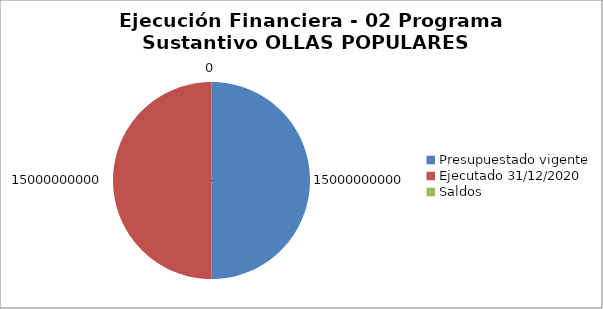
| Category | 0 0 0 |
|---|---|
| Presupuestado vigente | 15000000000 |
| Ejecutado 31/12/2020 | 15000000000 |
| Saldos | 0 |